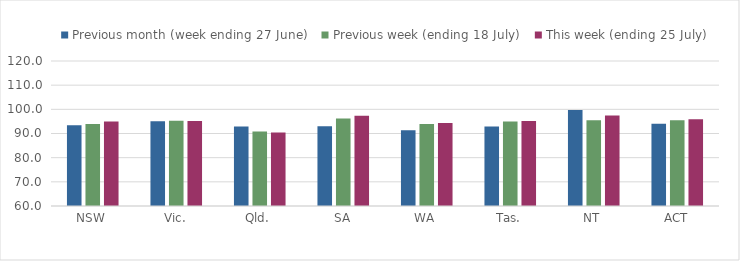
| Category | Previous month (week ending 27 June) | Previous week (ending 18 July) | This week (ending 25 July) |
|---|---|---|---|
| NSW | 93.448 | 93.961 | 95.005 |
| Vic. | 95.086 | 95.233 | 95.175 |
| Qld. | 92.854 | 90.864 | 90.381 |
| SA | 93.014 | 96.253 | 97.305 |
| WA | 91.376 | 93.951 | 94.303 |
| Tas. | 92.857 | 94.97 | 95.125 |
| NT | 99.701 | 95.522 | 97.433 |
| ACT | 94.042 | 95.472 | 95.874 |